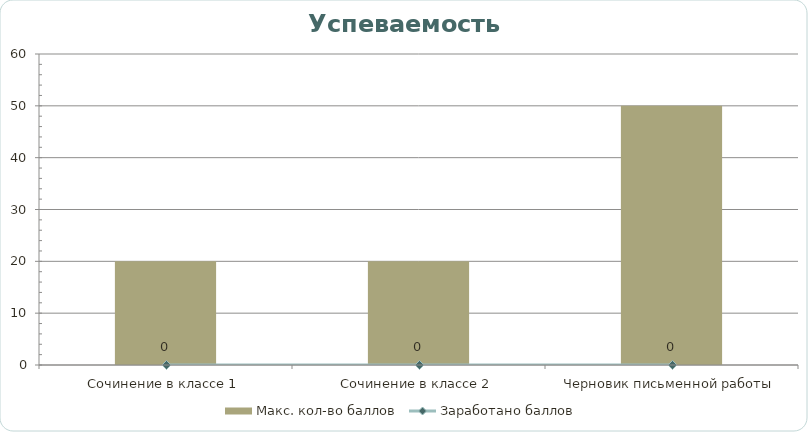
| Category | Макс. кол-во баллов |
|---|---|
| Сочинение в классе 1 | 20 |
| Сочинение в классе 2 | 20 |
| Черновик письменной работы | 50 |